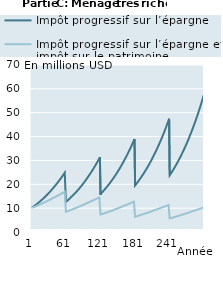
| Category | Impôt progressif sur l’épargne | Impôt progressif sur l’épargne et impôt sur le patrimoine |
|---|---|---|
| 1 | 10000000 | 10000000 |
| 2 | 10167750 | 10097750 |
| 3 | 10337932.375 | 10196233.125 |
| 4 | 10510582.394 | 10295454.873 |
| 5 | 10685735.839 | 10395420.785 |
| 6 | 10863429.009 | 10496136.441 |
| 7 | 11043698.729 | 10597607.464 |
| 8 | 11226582.361 | 10699839.52 |
| 9 | 11412117.805 | 10802838.317 |
| 10 | 11600343.513 | 10906609.604 |
| 11 | 11791298.494 | 11011159.176 |
| 12 | 11985022.323 | 11116492.87 |
| 13 | 12181555.146 | 11222616.566 |
| 14 | 12380937.696 | 11329536.191 |
| 15 | 12583211.292 | 11437257.712 |
| 16 | 12788417.856 | 11545787.145 |
| 17 | 12996599.915 | 11655130.548 |
| 18 | 13207800.614 | 11765294.028 |
| 19 | 13422063.723 | 11876283.733 |
| 20 | 13639433.647 | 11988105.861 |
| 21 | 13859955.435 | 12100766.655 |
| 22 | 14083674.788 | 12214272.405 |
| 23 | 14310638.073 | 12328629.448 |
| 24 | 14540892.325 | 12443844.168 |
| 25 | 14774485.264 | 12559923 |
| 26 | 15011465.3 | 12676872.422 |
| 27 | 15251881.547 | 12794698.965 |
| 28 | 15495783.829 | 12913409.208 |
| 29 | 15743222.695 | 13033009.777 |
| 30 | 15994249.424 | 13153507.35 |
| 31 | 16248916.04 | 13274908.655 |
| 32 | 16507275.323 | 13397220.47 |
| 33 | 16769380.815 | 13520449.624 |
| 34 | 17035286.837 | 13644602.996 |
| 35 | 17305048.496 | 13769687.518 |
| 36 | 17578721.699 | 13895710.175 |
| 37 | 17856363.164 | 14022678.001 |
| 38 | 18138030.43 | 14150598.086 |
| 39 | 18423781.871 | 14279477.572 |
| 40 | 18713676.708 | 14409323.653 |
| 41 | 19007775.021 | 14540143.581 |
| 42 | 19294587.758 | 14660394.658 |
| 43 | 19585559.281 | 14781547.618 |
| 44 | 19880749.89 | 14903609.225 |
| 45 | 20180220.764 | 15026586.294 |
| 46 | 20484033.965 | 15150485.691 |
| 47 | 20792252.457 | 15275314.334 |
| 48 | 21104940.118 | 15401079.191 |
| 49 | 21422161.75 | 15527787.285 |
| 50 | 21743983.095 | 15655445.69 |
| 51 | 22070470.85 | 15784061.533 |
| 52 | 22401692.677 | 15913641.994 |
| 53 | 22737717.221 | 16044194.309 |
| 54 | 23078614.121 | 16175725.766 |
| 55 | 23424454.026 | 16308243.71 |
| 56 | 23775308.609 | 16441755.537 |
| 57 | 24131250.584 | 16576268.704 |
| 58 | 24492353.717 | 16711790.719 |
| 59 | 24858692.846 | 16848329.15 |
| 60 | 25230343.892 | 16985891.618 |
| 61 | 12615171.946 | 8492945.809 |
| 62 | 12820841.939 | 8579392.903 |
| 63 | 13029494.148 | 8666488.349 |
| 64 | 13241171.813 | 8754237.012 |
| 65 | 13455918.804 | 8842643.79 |
| 66 | 13673779.627 | 8931713.618 |
| 67 | 13894799.431 | 9021451.47 |
| 68 | 14119024.023 | 9111862.356 |
| 69 | 14346499.871 | 9202951.324 |
| 70 | 14577274.119 | 9294723.459 |
| 71 | 14811394.594 | 9387183.885 |
| 72 | 15048909.816 | 9480337.764 |
| 73 | 15289869.008 | 9574190.297 |
| 74 | 15534322.109 | 9668746.724 |
| 75 | 15782319.779 | 9764012.325 |
| 76 | 16033913.416 | 9859992.417 |
| 77 | 16289155.161 | 9956692.36 |
| 78 | 16548097.91 | 10054117.553 |
| 79 | 16810795.33 | 10152273.435 |
| 80 | 17077301.862 | 10251165.485 |
| 81 | 17347672.739 | 10350799.227 |
| 82 | 17621963.994 | 10451180.221 |
| 83 | 17900232.472 | 10552314.072 |
| 84 | 18182535.843 | 10654206.428 |
| 85 | 18468932.613 | 10756862.976 |
| 86 | 18759482.136 | 10860289.449 |
| 87 | 19054244.627 | 10964491.619 |
| 88 | 19353281.174 | 11069475.307 |
| 89 | 19656653.751 | 11175246.371 |
| 90 | 19964425.23 | 11281810.719 |
| 91 | 20276659.396 | 11389174.3 |
| 92 | 20593420.957 | 11497343.107 |
| 93 | 20914775.561 | 11606323.18 |
| 94 | 21240789.807 | 11716120.604 |
| 95 | 21571531.259 | 11826741.508 |
| 96 | 21907068.462 | 11938192.07 |
| 97 | 22247470.955 | 12050478.51 |
| 98 | 22592809.284 | 12163607.099 |
| 99 | 22943155.018 | 12277584.152 |
| 100 | 23298580.766 | 12392416.034 |
| 101 | 23659160.187 | 12508109.154 |
| 102 | 24013418.01 | 12613119.972 |
| 103 | 24372812.571 | 12718918.372 |
| 104 | 24737418.353 | 12825510.26 |
| 105 | 25107310.919 | 12932901.587 |
| 106 | 25482566.928 | 13041098.349 |
| 107 | 25863264.148 | 13150106.586 |
| 108 | 26249481.478 | 13259932.386 |
| 109 | 26641298.96 | 13370581.879 |
| 110 | 27038797.795 | 13482061.243 |
| 111 | 27442060.363 | 13594376.702 |
| 112 | 27851170.238 | 13707534.527 |
| 113 | 28266212.206 | 13821541.036 |
| 114 | 28687272.283 | 13936402.594 |
| 115 | 29114437.731 | 14052125.614 |
| 116 | 29547797.079 | 14168716.556 |
| 117 | 29987440.136 | 14286181.93 |
| 118 | 30433458.018 | 14404528.294 |
| 119 | 30885943.159 | 14523762.257 |
| 120 | 31344989.335 | 14643890.473 |
| 121 | 15672494.668 | 7321945.237 |
| 122 | 16152881.512 | 7399609.826 |
| 123 | 16409848.294 | 7477856.9 |
| 124 | 16670541.094 | 7556690.826 |
| 125 | 16935013.94 | 7636116.008 |
| 126 | 17203321.642 | 7716136.878 |
| 127 | 17475519.806 | 7796757.904 |
| 128 | 17751664.843 | 7877983.589 |
| 129 | 18031813.983 | 7959818.466 |
| 130 | 18316025.286 | 8042267.104 |
| 131 | 18604357.653 | 8125334.107 |
| 132 | 18896870.839 | 8209024.113 |
| 133 | 19193625.466 | 8293341.794 |
| 134 | 19494683.035 | 8378291.857 |
| 135 | 19800105.939 | 8463879.046 |
| 136 | 20109957.475 | 8550108.139 |
| 137 | 20424301.859 | 8636983.95 |
| 138 | 20743204.236 | 8724511.33 |
| 139 | 21066730.697 | 8812695.165 |
| 140 | 21394948.292 | 8901540.379 |
| 141 | 21727925.042 | 8991051.931 |
| 142 | 22065729.955 | 9081234.821 |
| 143 | 22408433.04 | 9172094.082 |
| 144 | 22756105.319 | 9263634.788 |
| 145 | 23108818.846 | 9355862.049 |
| 146 | 23466646.719 | 9448781.014 |
| 147 | 23829663.097 | 9542396.872 |
| 148 | 24197943.212 | 9636714.848 |
| 149 | 24571563.388 | 9731740.209 |
| 150 | 24950601.057 | 9827478.261 |
| 151 | 25335134.773 | 9923934.348 |
| 152 | 25725244.227 | 10021113.856 |
| 153 | 26121010.268 | 10119022.209 |
| 154 | 26522514.917 | 10217664.876 |
| 155 | 26929841.383 | 10317047.363 |
| 156 | 27343074.083 | 10417175.218 |
| 157 | 27762298.658 | 10518054.032 |
| 158 | 28187601.988 | 10619689.437 |
| 159 | 28619072.217 | 10722087.108 |
| 160 | 29056798.764 | 10825252.761 |
| 161 | 29500872.346 | 10929192.157 |
| 162 | 29939834.995 | 11022361.098 |
| 163 | 30385162.603 | 11116228.806 |
| 164 | 30836947.46 | 11210800.522 |
| 165 | 31295283.198 | 11306081.526 |
| 166 | 31760264.805 | 11402077.138 |
| 167 | 32231988.645 | 11498792.716 |
| 168 | 32710552.48 | 11596233.662 |
| 169 | 33196055.491 | 11694405.414 |
| 170 | 33688598.295 | 11793313.455 |
| 171 | 34188282.971 | 11892963.306 |
| 172 | 34695213.074 | 11993360.531 |
| 173 | 35209493.663 | 12094510.734 |
| 174 | 35731231.322 | 12196419.565 |
| 175 | 36260534.176 | 12299092.712 |
| 176 | 36797511.921 | 12402535.907 |
| 177 | 37342275.844 | 12506754.926 |
| 178 | 37894938.844 | 12611755.588 |
| 179 | 38455615.457 | 12717543.755 |
| 180 | 39024421.881 | 12824125.333 |
| 181 | 19512210.941 | 6412062.667 |
| 182 | 19817887.999 | 6482903.137 |
| 183 | 20127997.375 | 6554274.91 |
| 184 | 20442603.337 | 6626181.972 |
| 185 | 20761771.086 | 6698628.337 |
| 186 | 21085566.766 | 6771618.049 |
| 187 | 21414057.484 | 6845155.185 |
| 188 | 21747311.318 | 6919243.849 |
| 189 | 22085397.332 | 6993888.177 |
| 190 | 22428385.593 | 7069092.339 |
| 191 | 22776347.184 | 7144860.531 |
| 192 | 23129354.219 | 7221196.985 |
| 193 | 23487479.855 | 7298105.963 |
| 194 | 23850798.313 | 7375591.757 |
| 195 | 24219384.888 | 7453658.696 |
| 196 | 24593315.969 | 7532311.136 |
| 197 | 24972669.051 | 7611553.469 |
| 198 | 25357522.752 | 7691390.12 |
| 199 | 25747956.832 | 7771825.546 |
| 200 | 26144052.206 | 7852864.238 |
| 201 | 26545890.963 | 7934510.72 |
| 202 | 26953556.382 | 8016769.55 |
| 203 | 27367132.949 | 8099645.322 |
| 204 | 27786706.377 | 8183142.662 |
| 205 | 28212363.62 | 8267266.232 |
| 206 | 28644192.892 | 8352020.728 |
| 207 | 29082283.689 | 8437410.884 |
| 208 | 29526726.802 | 8523441.465 |
| 209 | 29977614.341 | 8610117.276 |
| 210 | 30435039.749 | 8697443.156 |
| 211 | 30899097.825 | 8785423.98 |
| 212 | 31369884.744 | 8874064.659 |
| 213 | 31847498.073 | 8963370.144 |
| 214 | 32332036.795 | 9053345.421 |
| 215 | 32823601.328 | 9143995.511 |
| 216 | 33322293.548 | 9235325.477 |
| 217 | 33828216.804 | 9327340.419 |
| 218 | 34341475.948 | 9420045.472 |
| 219 | 34862177.349 | 9513445.813 |
| 220 | 35390428.92 | 9607546.656 |
| 221 | 35926340.14 | 9702353.256 |
| 222 | 36458472.072 | 9786320.906 |
| 223 | 36998319.917 | 9870918.312 |
| 224 | 37545995.556 | 9956150.2 |
| 225 | 38101612.491 | 10042021.326 |
| 226 | 38665285.872 | 10128536.486 |
| 227 | 39237132.517 | 10215700.51 |
| 228 | 39817270.939 | 10303518.264 |
| 229 | 40405821.368 | 10391994.651 |
| 230 | 41002905.777 | 10481134.611 |
| 231 | 41608647.911 | 10570943.12 |
| 232 | 42223173.306 | 10661425.194 |
| 233 | 42846609.319 | 10752585.883 |
| 234 | 43479085.154 | 10844430.277 |
| 235 | 44120731.889 | 10936963.504 |
| 236 | 44771682.501 | 11030190.73 |
| 237 | 45432071.897 | 11124117.16 |
| 238 | 46102036.94 | 11218748.039 |
| 239 | 46781716.475 | 11314088.649 |
| 240 | 47471251.364 | 11410144.314 |
| 241 | 23735625.682 | 5705072.157 |
| 242 | 24102542.255 | 5770610.198 |
| 243 | 24474779.117 | 5836639.775 |
| 244 | 24852413.414 | 5903164.573 |
| 245 | 25235523.409 | 5970188.307 |
| 246 | 25624188.498 | 6037714.72 |
| 247 | 26018489.232 | 6105747.58 |
| 248 | 26418507.325 | 6174290.687 |
| 249 | 26824325.682 | 6243347.867 |
| 250 | 27236028.404 | 6312922.976 |
| 251 | 27653700.816 | 6383019.898 |
| 252 | 28077429.478 | 6453642.548 |
| 253 | 28507302.205 | 6524794.867 |
| 254 | 28943408.087 | 6596480.828 |
| 255 | 29385837.504 | 6668704.435 |
| 256 | 29834682.148 | 6741469.718 |
| 257 | 30290035.039 | 6814780.741 |
| 258 | 30751990.547 | 6888641.596 |
| 259 | 31220644.41 | 6963056.408 |
| 260 | 31696093.754 | 7038029.331 |
| 261 | 32178437.114 | 7113564.551 |
| 262 | 32667774.452 | 7189666.285 |
| 263 | 33164207.182 | 7266338.783 |
| 264 | 33667838.186 | 7343586.323 |
| 265 | 34178771.839 | 7421413.221 |
| 266 | 34697114.031 | 7499823.82 |
| 267 | 35222972.184 | 7578822.499 |
| 268 | 35756455.281 | 7658413.667 |
| 269 | 36297673.883 | 7738601.77 |
| 270 | 36846740.154 | 7819391.283 |
| 271 | 37403767.886 | 7900786.718 |
| 272 | 37968872.521 | 7982792.618 |
| 273 | 38542171.172 | 8065413.563 |
| 274 | 39123782.654 | 8148654.165 |
| 275 | 39713827.503 | 8232519.071 |
| 276 | 40312428.001 | 8317012.964 |
| 277 | 40919708.207 | 8402140.561 |
| 278 | 41535793.976 | 8487906.615 |
| 279 | 42160812.989 | 8574315.915 |
| 280 | 42794894.777 | 8661373.284 |
| 281 | 43438170.752 | 8749083.584 |
| 282 | 44079224.228 | 8825901.711 |
| 283 | 44729572.979 | 8903295.974 |
| 284 | 45389351.787 | 8981270.693 |
| 285 | 46058697.388 | 9059830.224 |
| 286 | 46737748.5 | 9138978.95 |
| 287 | 47426645.853 | 9218721.292 |
| 288 | 48125532.218 | 9299061.702 |
| 289 | 48834552.435 | 9380004.665 |
| 290 | 49553853.446 | 9461554.7 |
| 291 | 50283584.321 | 9543716.36 |
| 292 | 51023896.293 | 9626494.233 |
| 293 | 51774942.79 | 9709892.939 |
| 294 | 52536879.46 | 9793917.137 |
| 295 | 53309864.212 | 9878571.515 |
| 296 | 54094057.243 | 9963860.801 |
| 297 | 54889621.073 | 10049789.757 |
| 298 | 55696720.579 | 10136363.181 |
| 299 | 56515523.027 | 10223585.904 |
| 300 | 57346198.111 | 10311462.799 |